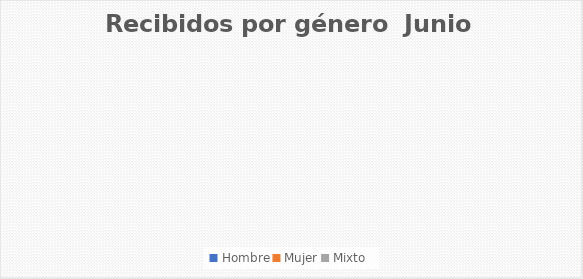
| Category | Recibidos por género  Junio |
|---|---|
| Hombre | 0 |
| Mujer | 0 |
| Mixto | 0 |